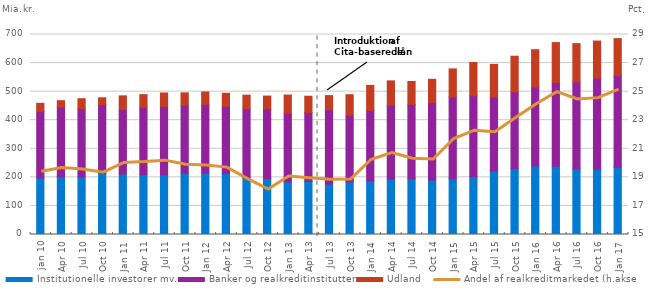
| Category | Institutionelle investorer mv. | Banker og realkreditinstitutter | Udland |
|---|---|---|---|
| jan 10 | 197.599 | 232.386 | 29.122 |
| apr 10 | 201.895 | 244.36 | 22.11 |
| jul 10 | 200.917 | 240.039 | 34.331 |
| okt 10 | 213.281 | 241.061 | 24.218 |
| jan 11 | 211.587 | 225.677 | 48.024 |
| apr 11 | 209.763 | 235.958 | 43.732 |
| jul 11 | 208.521 | 239.926 | 46.897 |
| okt 11 | 214.445 | 237.337 | 44.016 |
| jan 12 | 215.102 | 241.001 | 42.803 |
| apr 12 | 212.818 | 236.159 | 45.249 |
| jul 12 | 197.564 | 242.607 | 47.53 |
| okt 12 | 196.025 | 244.04 | 44.477 |
| jan 13 | 184.026 | 240.384 | 63.617 |
| apr 13 | 185.543 | 241.726 | 56.741 |
| jul 13 | 176.463 | 260.452 | 49.269 |
| okt 13 | 183.687 | 234.454 | 71.079 |
| jan 14 | 187.149 | 247.382 | 87.316 |
| apr 14 | 193.698 | 258.746 | 85.254 |
| jul 14 | 195.045 | 260.246 | 80.137 |
| okt 14 | 190.7 | 271.384 | 81.041 |
| jan 15 | 195.435 | 286.213 | 97.983 |
| apr 15 | 202.51 | 283.13 | 116.391 |
| jul 15 | 222.089 | 259.06 | 114.362 |
| okt 15 | 230.186 | 268.488 | 125.342 |
| jan 16 | 239.713 | 277.028 | 130.108 |
| apr 16 | 238.442 | 293.849 | 139.41 |
| jul 16 | 229.626 | 304.551 | 133.826 |
| okt 16 | 228.415 | 319.301 | 129.375 |
| jan 17 | 235.386 | 320.782 | 129.346 |